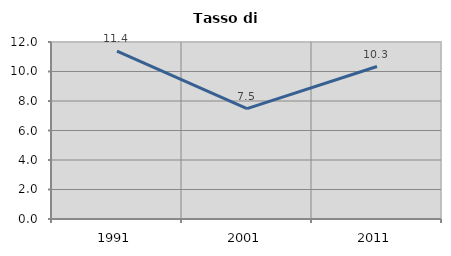
| Category | Tasso di disoccupazione   |
|---|---|
| 1991.0 | 11.384 |
| 2001.0 | 7.482 |
| 2011.0 | 10.338 |